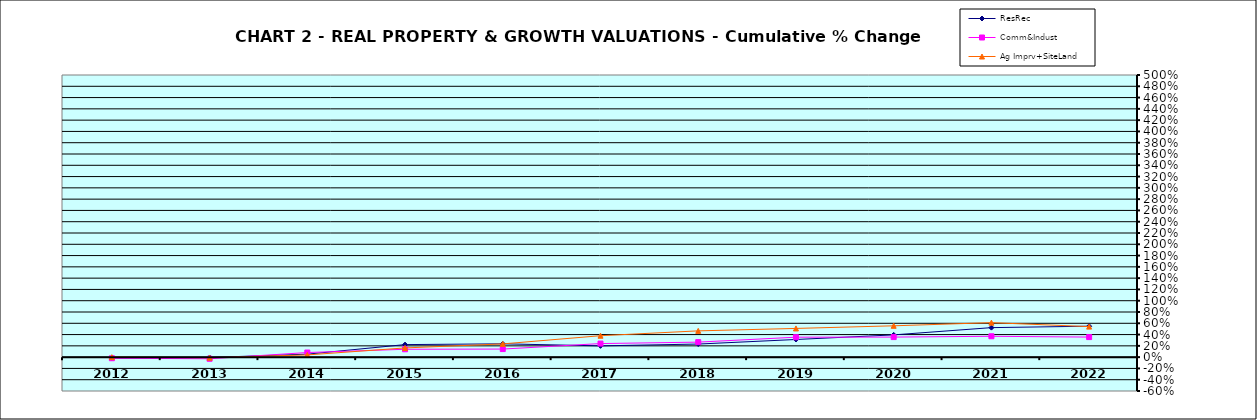
| Category | ResRec | Comm&Indust | Ag Imprv+SiteLand |
|---|---|---|---|
| 2012.0 | -0.013 | -0.019 | 0 |
| 2013.0 | -0.006 | -0.029 | -0.01 |
| 2014.0 | 0.053 | 0.082 | 0.04 |
| 2015.0 | 0.222 | 0.14 | 0.163 |
| 2016.0 | 0.236 | 0.143 | 0.235 |
| 2017.0 | 0.2 | 0.24 | 0.38 |
| 2018.0 | 0.232 | 0.266 | 0.466 |
| 2019.0 | 0.313 | 0.354 | 0.509 |
| 2020.0 | 0.394 | 0.356 | 0.555 |
| 2021.0 | 0.523 | 0.37 | 0.611 |
| 2022.0 | 0.548 | 0.356 | 0.541 |